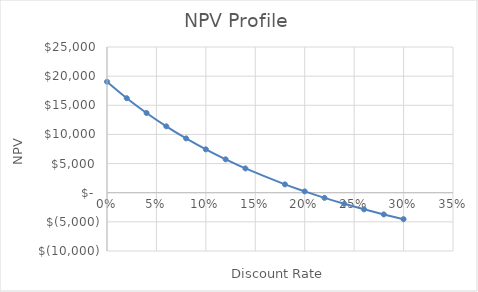
| Category | Series 0 |
|---|---|
| 0.0 | 19035 |
| 0.02 | 16216.599 |
| 0.04 | 13680.348 |
| 0.06 | 11391.23 |
| 0.08 | 9319.269 |
| 0.1 | 7438.716 |
| 0.12 | 5727.377 |
| 0.14 | 4166.063 |
| 0.18 | 1429.106 |
| 0.2 | 226.352 |
| 0.22 | -881.18 |
| 0.24 | -1903.185 |
| 0.26 | -2848.191 |
| 0.28 | -3723.717 |
| 0.3 | -4536.41 |